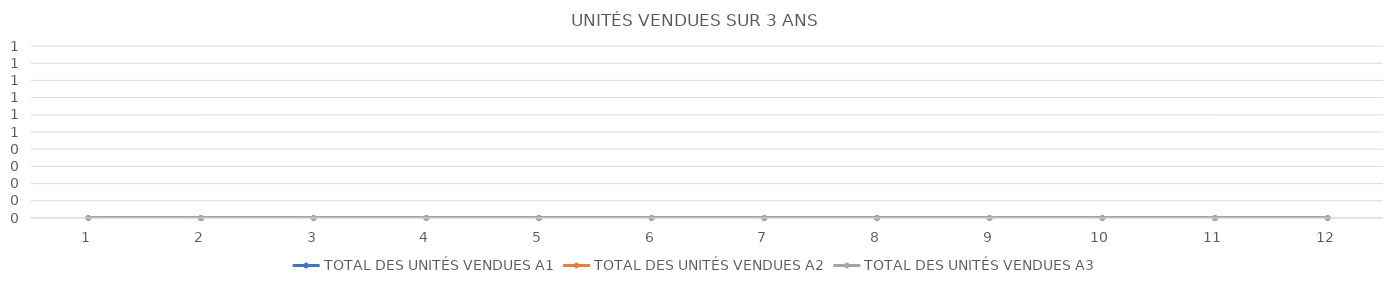
| Category | TOTAL DES UNITÉS VENDUES A1 | TOTAL DES UNITÉS VENDUES A2 | TOTAL DES UNITÉS VENDUES A3 |
|---|---|---|---|
| 0 | 0 | 0 | 0 |
| 1 | 0 | 0 | 0 |
| 2 | 0 | 0 | 0 |
| 3 | 0 | 0 | 0 |
| 4 | 0 | 0 | 0 |
| 5 | 0 | 0 | 0 |
| 6 | 0 | 0 | 0 |
| 7 | 0 | 0 | 0 |
| 8 | 0 | 0 | 0 |
| 9 | 0 | 0 | 0 |
| 10 | 0 | 0 | 0 |
| 11 | 0 | 0 | 0 |